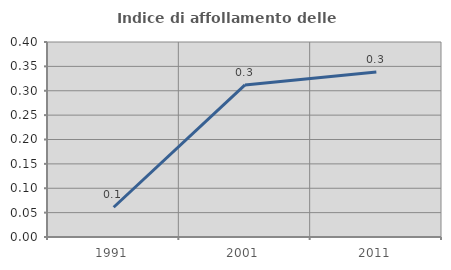
| Category | Indice di affollamento delle abitazioni  |
|---|---|
| 1991.0 | 0.061 |
| 2001.0 | 0.312 |
| 2011.0 | 0.338 |